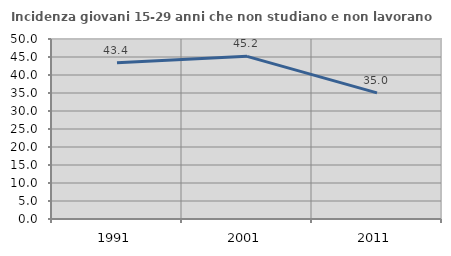
| Category | Incidenza giovani 15-29 anni che non studiano e non lavorano  |
|---|---|
| 1991.0 | 43.404 |
| 2001.0 | 45.183 |
| 2011.0 | 35.05 |